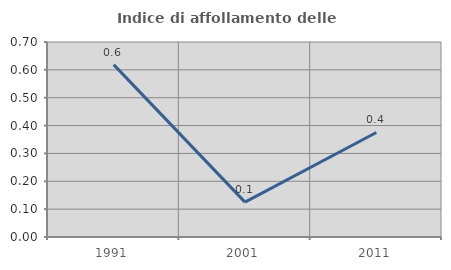
| Category | Indice di affollamento delle abitazioni  |
|---|---|
| 1991.0 | 0.619 |
| 2001.0 | 0.125 |
| 2011.0 | 0.375 |